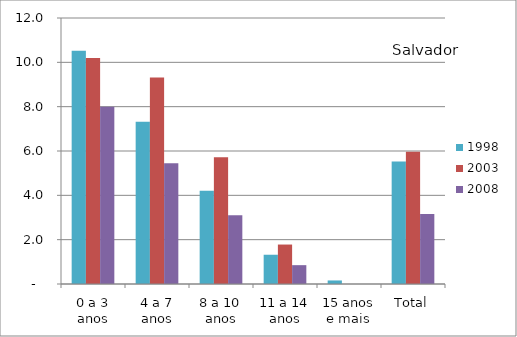
| Category | 1998 | 2003 | 2008 |
|---|---|---|---|
| 0 a 3 anos | 10.52 | 10.19 | 8 |
| 4 a 7 anos | 7.32 | 9.32 | 5.45 |
| 8 a 10 anos | 4.21 | 5.72 | 3.1 |
| 11 a 14 anos | 1.32 | 1.78 | 0.85 |
| 15 anos e mais | 0.16 | 0 | 0 |
| Total | 5.53 | 5.97 | 3.16 |